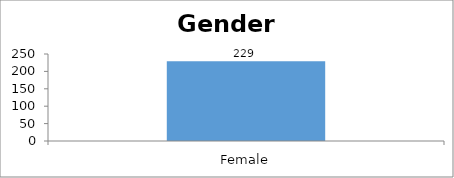
| Category | Gender |
|---|---|
| Female | 229 |